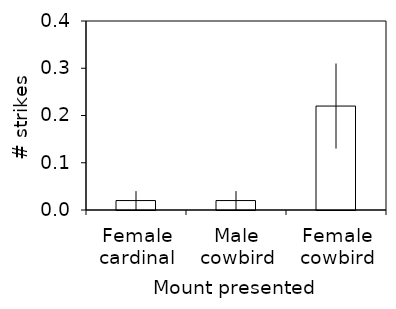
| Category | Strike |
|---|---|
| Female cardinal | 0.02 |
| Male cowbird | 0.02 |
| Female cowbird | 0.22 |